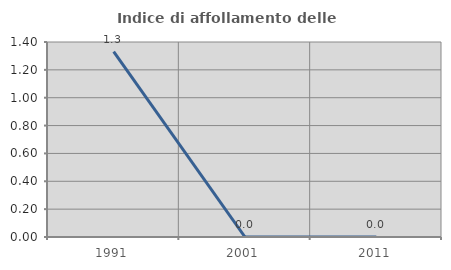
| Category | Indice di affollamento delle abitazioni  |
|---|---|
| 1991.0 | 1.33 |
| 2001.0 | 0 |
| 2011.0 | 0 |